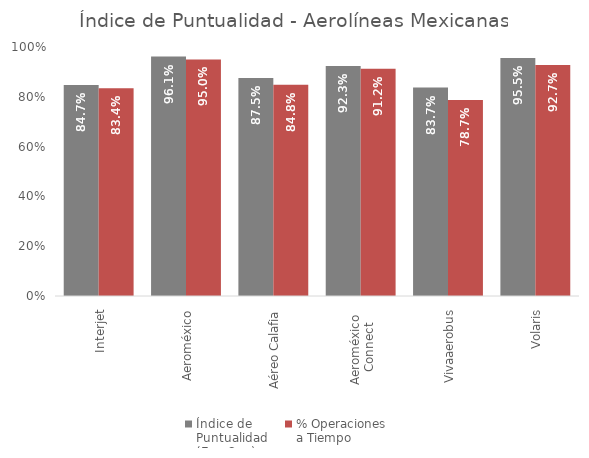
| Category | Índice de 
Puntualidad
(Ene-Sep) | % Operaciones 
a Tiempo |
|---|---|---|
| Interjet | 0.847 | 0.834 |
| Aeroméxico | 0.961 | 0.95 |
| Aéreo Calafia | 0.875 | 0.848 |
| Aeroméxico 
Connect | 0.923 | 0.912 |
| Vivaaerobus | 0.837 | 0.787 |
| Volaris | 0.955 | 0.927 |